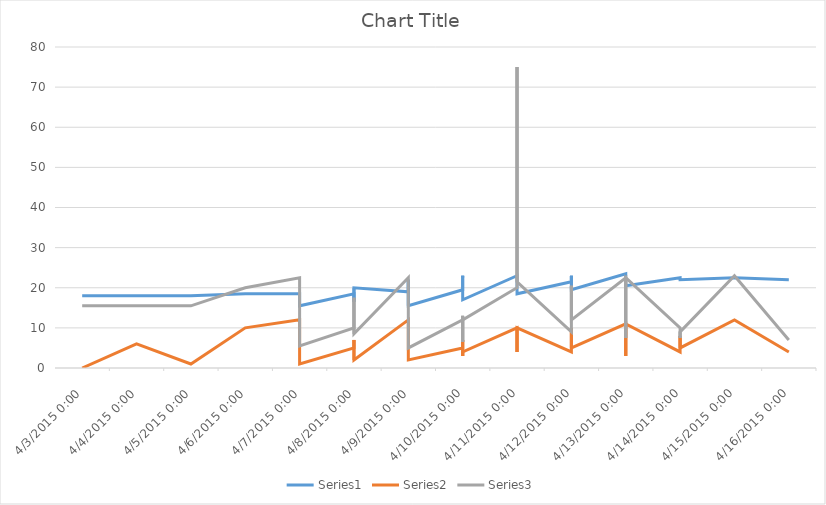
| Category | Series 0 | Series 1 | Series 2 |
|---|---|---|---|
| 4/3/15 | 18 | 0 | 15.5 |
| 4/4/15 | 18 | 6 | 15.5 |
| 4/5/15 | 18 | 1 | 15.5 |
| 4/6/15 | 18.5 | 10 | 20 |
| 4/7/15 | 18.5 | 12 | 22.5 |
| 4/7/15 | 15.5 | 1 | 5.5 |
| 4/8/15 | 18.5 | 5 | 10 |
| 4/8/15 | 16.5 | 7 | 17.5 |
| 4/8/15 | 20 | 2 | 8.5 |
| 4/9/15 | 19 | 12 | 22.5 |
| 4/9/15 | 20.5 | 10 | 21.5 |
| 4/9/15 | 22 | 5 | 12 |
| 4/9/15 | 15.5 | 2 | 5 |
| 4/10/15 | 19.5 | 5 | 12 |
| 4/10/15 | 23 | 7 | 13 |
| 4/10/15 | 22.5 | 3 | 6.5 |
| 4/10/15 | 17 | 4 | 12 |
| 4/11/15 | 23 | 10 | 20 |
| 4/11/15 | 22 | 4 | 75 |
| 4/11/15 | 18.5 | 10 | 21.5 |
| 4/12/15 | 21.5 | 4 | 9 |
| 4/12/15 | 23 | 10 | 20.5 |
| 4/12/15 | 19.5 | 5 | 12 |
| 4/13/15 | 23.5 | 11 | 22.5 |
| 4/13/15 | 23 | 3 | 7.5 |
| 4/13/15 | 20.5 | 11 | 22.5 |
| 4/14/15 | 22.5 | 4 | 10 |
| 4/14/15 | 22.5 | 8 | 7.5 |
| 4/14/15 | 22 | 5 | 9 |
| 4/15/15 | 22.5 | 12 | 23 |
| 4/16/15 | 22 | 4 | 7 |